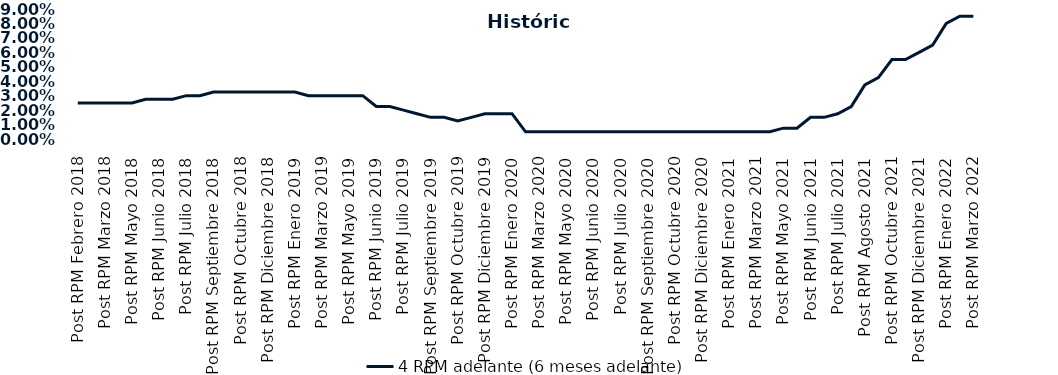
| Category | 4 RPM adelante (6 meses adelante) |
|---|---|
| Post RPM Febrero 2018 | 0.025 |
| Pre RPM Marzo 2018 | 0.025 |
| Post RPM Marzo 2018 | 0.025 |
| Pre RPM Mayo 2018 | 0.025 |
| Post RPM Mayo 2018 | 0.025 |
| Pre RPM Junio 2018 | 0.028 |
| Post RPM Junio 2018 | 0.028 |
| Pre RPM Julio 2018 | 0.028 |
| Post RPM Julio 2018 | 0.03 |
| Pre RPM Septiembre 2018 | 0.03 |
| Post RPM Septiembre 2018 | 0.032 |
| Pre RPM Octubre 2018 | 0.032 |
| Post RPM Octubre 2018 | 0.032 |
| Pre RPM Diciembre 2018 | 0.032 |
| Post RPM Diciembre 2018 | 0.032 |
| Pre RPM Enero 2019 | 0.032 |
| Post RPM Enero 2019 | 0.032 |
| Pre RPM Marzo 2019 | 0.03 |
| Post RPM Marzo 2019 | 0.03 |
| Pre RPM Mayo 2019 | 0.03 |
| Post RPM Mayo 2019 | 0.03 |
| Pre RPM Junio 2019 | 0.03 |
| Post RPM Junio 2019 | 0.022 |
| Pre RPM Julio 2019 | 0.022 |
| Post RPM Julio 2019 | 0.02 |
| Pre RPM Septiembre 2019 | 0.018 |
| Post RPM Septiembre 2019 | 0.015 |
| Pre RPM Octubre 2019 | 0.015 |
| Post RPM Octubre 2019 | 0.012 |
| Pre RPM Diciembre 2019 | 0.015 |
| Post RPM Diciembre 2019 | 0.018 |
| Pre RPM Enero 2020 | 0.018 |
| Post RPM Enero 2020 | 0.018 |
| Pre RPM Marzo 2020 | 0.005 |
| Post RPM Marzo 2020 | 0.005 |
| Pre RPM Mayo 2020 | 0.005 |
| Post RPM Mayo 2020 | 0.005 |
| Pre RPM Junio 2020 | 0.005 |
| Post RPM Junio 2020 | 0.005 |
| Pre RPM Julio 2020 | 0.005 |
| Post RPM Julio 2020 | 0.005 |
| Pre RPM Septiembre 2020 | 0.005 |
| Post RPM Septiembre 2020 | 0.005 |
| Pre RPM Octubre 2020 | 0.005 |
| Post RPM Octubre 2020 | 0.005 |
| Pre RPM Diciembre 2020 | 0.005 |
| Post RPM Diciembre 2020 | 0.005 |
| Pre RPM Enero 2021 | 0.005 |
| Post RPM Enero 2021 | 0.005 |
| Pre RPM Marzo 2021 | 0.005 |
| Post RPM Marzo 2021 | 0.005 |
| Pre RPM Mayo 2021 | 0.005 |
| Post RPM Mayo 2021 | 0.008 |
| Pre RPM Junio 2021 | 0.008 |
| Post RPM Junio 2021 | 0.015 |
| Pre RPM Julio 2021 | 0.015 |
| Post RPM Julio 2021 | 0.018 |
| Pre RPM Agosto 2021 | 0.022 |
| Post RPM Agosto 2021 | 0.038 |
| Pre RPM Octubre 2021 | 0.042 |
| Post RPM Octubre 2021 | 0.055 |
| Pre RPM Diciembre 2021 | 0.055 |
| Post RPM Diciembre 2021 | 0.06 |
| Pre RPM Enero 2022 | 0.065 |
| Post RPM Enero 2022 | 0.08 |
| Pre RPM Marzo 2022 | 0.085 |
| Post RPM Marzo 2022 | 0.085 |